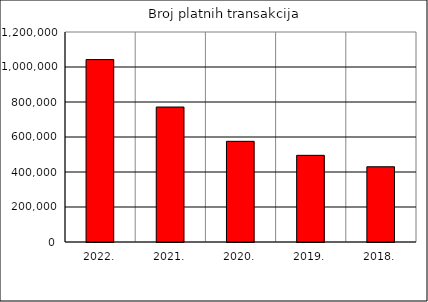
| Category | Broj platnih transakcija |
|---|---|
| 2022. | 1042369 |
| 2021. | 771176 |
| 2020. | 575280 |
| 2019. | 495238 |
| 2018. | 429847 |